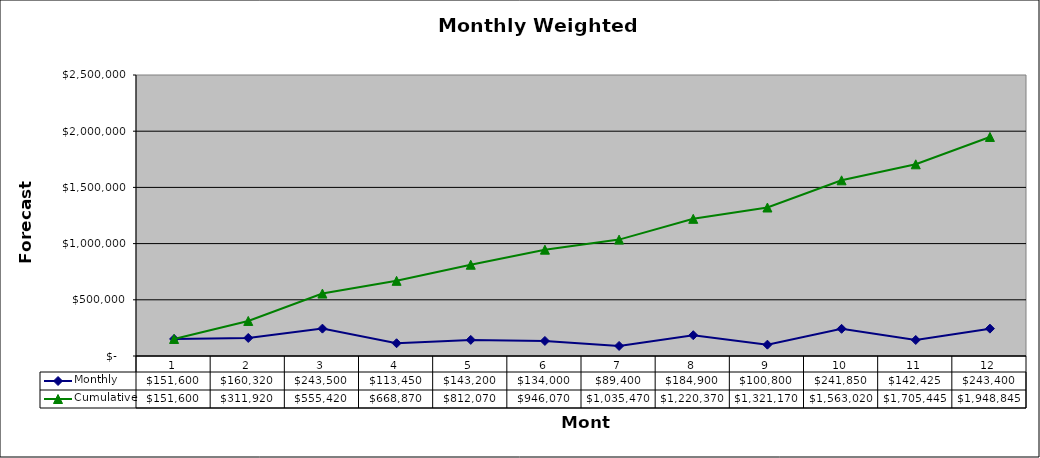
| Category | Monthly | Cumulative |
|---|---|---|
| 0 | 151600 | 151600 |
| 1 | 160320 | 311920 |
| 2 | 243500 | 555420 |
| 3 | 113450 | 668870 |
| 4 | 143200 | 812070 |
| 5 | 134000 | 946070 |
| 6 | 89400 | 1035470 |
| 7 | 184900 | 1220370 |
| 8 | 100800 | 1321170 |
| 9 | 241850 | 1563020 |
| 10 | 142425 | 1705445 |
| 11 | 243400 | 1948845 |